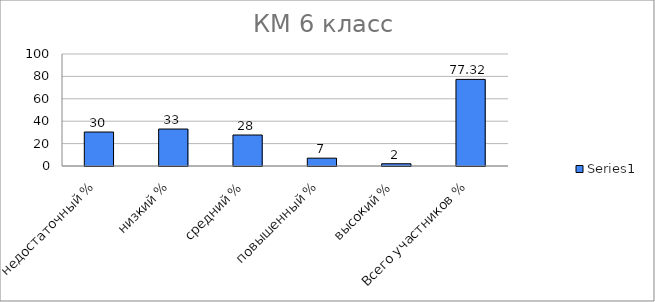
| Category | Series 0 |
|---|---|
| недостаточный % | 30.333 |
| низкий % | 33 |
| средний % | 27.667 |
| повышенный % | 7 |
| высокий % | 2 |
| Всего участников % | 77.32 |